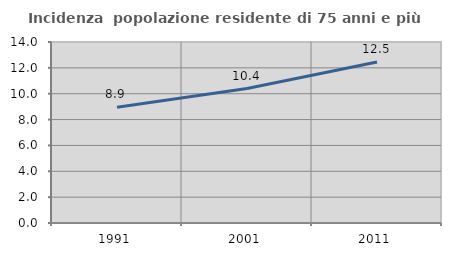
| Category | Incidenza  popolazione residente di 75 anni e più |
|---|---|
| 1991.0 | 8.945 |
| 2001.0 | 10.397 |
| 2011.0 | 12.453 |